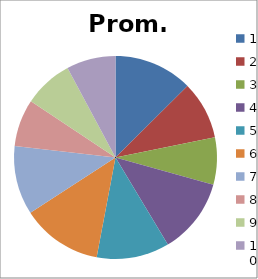
| Category | Prom. |
|---|---|
| 0 | 8 |
| 1 | 5.9 |
| 2 | 4.8 |
| 3 | 7.7 |
| 4 | 7.4 |
| 5 | 8.2 |
| 6 | 7 |
| 7 | 4.8 |
| 8 | 5 |
| 9 | 5 |